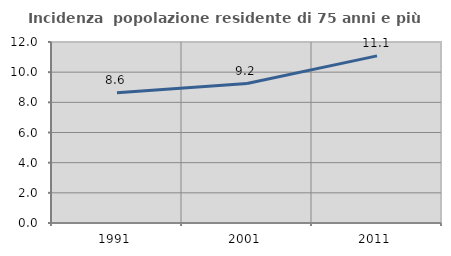
| Category | Incidenza  popolazione residente di 75 anni e più |
|---|---|
| 1991.0 | 8.639 |
| 2001.0 | 9.244 |
| 2011.0 | 11.078 |